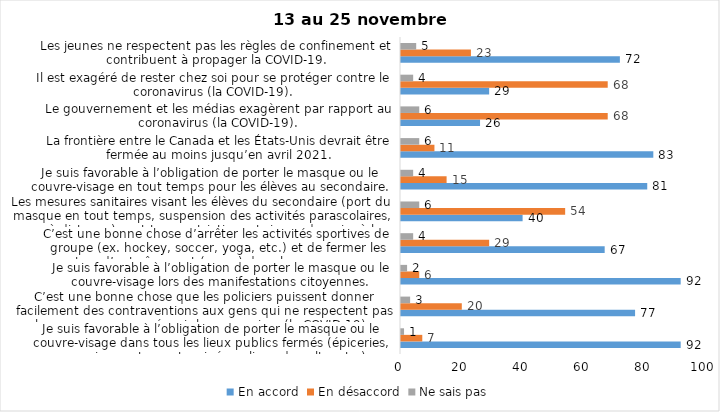
| Category | En accord | En désaccord | Ne sais pas |
|---|---|---|---|
| Je suis favorable à l’obligation de porter le masque ou le couvre-visage dans tous les lieux publics fermés (épiceries, magasins, restaurants, cinéma, lieux de culte, etc.). | 92 | 7 | 1 |
| C’est une bonne chose que les policiers puissent donner facilement des contraventions aux gens qui ne respectent pas les mesures pour prévenir le coronavirus (la COVID-19). | 77 | 20 | 3 |
| Je suis favorable à l’obligation de porter le masque ou le couvre-visage lors des manifestations citoyennes. | 92 | 6 | 2 |
| C’est une bonne chose d’arrêter les activités sportives de groupe (ex. hockey, soccer, yoga, etc.) et de fermer les centres d’entraînement (gyms) dans les zones rouges. | 67 | 29 | 4 |
| Les mesures sanitaires visant les élèves du secondaire (port du masque en tout temps, suspension des activités parascolaires, cours à distance) sont trop restrictives et risque de nuire à leur santé mentale et leur développement. | 40 | 54 | 6 |
| Je suis favorable à l’obligation de porter le masque ou le couvre-visage en tout temps pour les élèves au secondaire. | 81 | 15 | 4 |
| La frontière entre le Canada et les États-Unis devrait être fermée au moins jusqu’en avril 2021. | 83 | 11 | 6 |
| Le gouvernement et les médias exagèrent par rapport au coronavirus (la COVID-19). | 26 | 68 | 6 |
| Il est exagéré de rester chez soi pour se protéger contre le coronavirus (la COVID-19). | 29 | 68 | 4 |
| Les jeunes ne respectent pas les règles de confinement et contribuent à propager la COVID-19. | 72 | 23 | 5 |